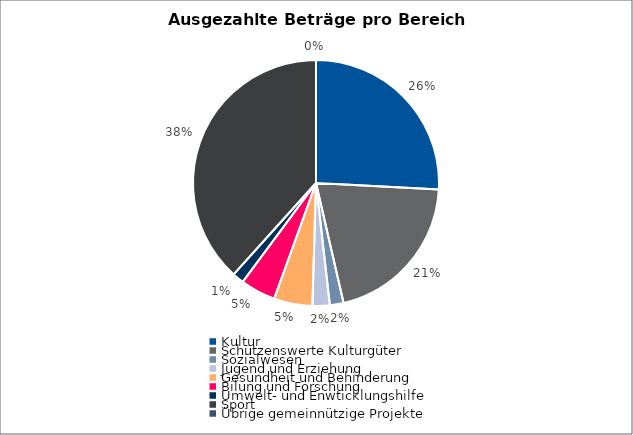
| Category | Series 0 |
|---|---|
| Kultur | 1968088.45 |
| Schützenswerte Kulturgüter | 1566617 |
| Sozialwesen | 137280 |
| Jugend und Erziehung | 172279.75 |
| Gesundheit und Behinderung | 385062.5 |
| Bilung und Forschung | 352681 |
| Umwelt- und Enwticklungshilfe | 115500 |
| Sport | 2920102.5 |
| Übrige gemeinnützige Projekte | 0 |